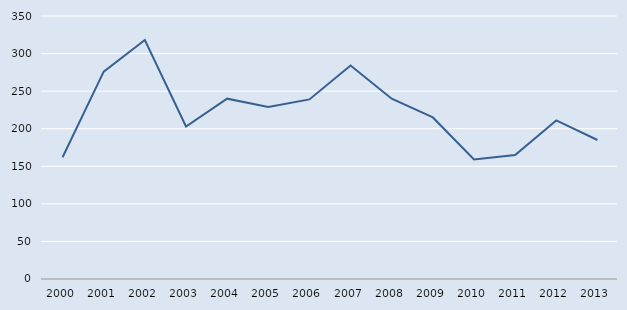
| Category | Series 0 |
|---|---|
| 2000.0 | 162 |
| 2001.0 | 276 |
| 2002.0 | 318 |
| 2003.0 | 203 |
| 2004.0 | 240 |
| 2005.0 | 229 |
| 2006.0 | 239 |
| 2007.0 | 284 |
| 2008.0 | 240 |
| 2009.0 | 215 |
| 2010.0 | 159 |
| 2011.0 | 165 |
| 2012.0 | 211 |
| 2013.0 | 185 |